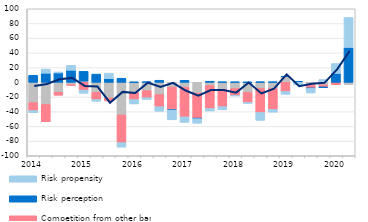
| Category | Costs of funding | Competition from other banks | Risk perception | Risk propensity |
|---|---|---|---|---|
| 2014.0 | -27.614 | -10.883 | 9.484 | -2.931 |
| nan | -30.154 | -23.565 | 12.376 | 5.591 |
| nan | -13.58 | -4.04 | 12.739 | 1.322 |
| nan | -3.194 | -0.943 | 16.324 | 6.815 |
| 2015.0 | 1.584 | -10.634 | 13.285 | -4.309 |
| nan | -13.709 | -9.748 | 11.117 | -2.291 |
| nan | -21.32 | -4.036 | 5.049 | 7.435 |
| nan | -44.371 | -37.787 | 5.514 | -6.068 |
| 2016.0 | -13.683 | -9.865 | 0.112 | -5.896 |
| nan | -11.339 | -9.602 | 0.723 | -2.332 |
| nan | -16.54 | -16.708 | 2.765 | -6.073 |
| nan | -6.439 | -30.804 | -0.484 | -13.396 |
| 2017.0 | -6.563 | -40.484 | 2.656 | -7.434 |
| nan | -14.708 | -34.121 | -0.712 | -6.144 |
| nan | -4.365 | -31.359 | 1.462 | -3.307 |
| nan | -9.63 | -23.589 | 0.436 | -4.267 |
| 2018.0 | -8.401 | -9.465 | 0.383 | -0.758 |
| nan | -13.817 | -13.719 | 0.033 | -1.188 |
| nan | -8.391 | -32.723 | 0.518 | -10.656 |
| nan | -8.386 | -28.581 | 0.546 | -3.682 |
| 2019.0 | 7.614 | -12.529 | 0.567 | -3.764 |
| nan | -0.003 | 0 | 1.352 | -3.594 |
| nan | -3.529 | -4.583 | -0.182 | -6.275 |
| nan | -3.387 | -3.387 | -0.185 | 3.746 |
| 2020.0 | 0 | -3.3 | 12 | 13.5 |
| nan | -3.3 | 0 | 47.4 | 40.8 |